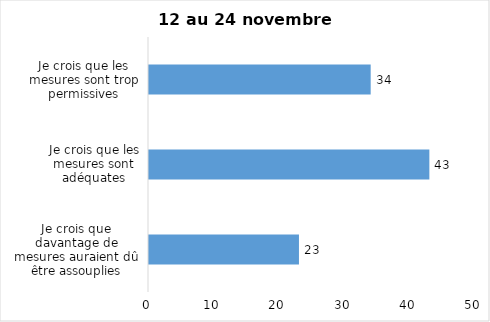
| Category | Series 0 |
|---|---|
| Je crois que davantage de mesures auraient dû être assouplies | 23 |
| Je crois que les mesures sont adéquates | 43 |
| Je crois que les mesures sont trop permissives | 34 |